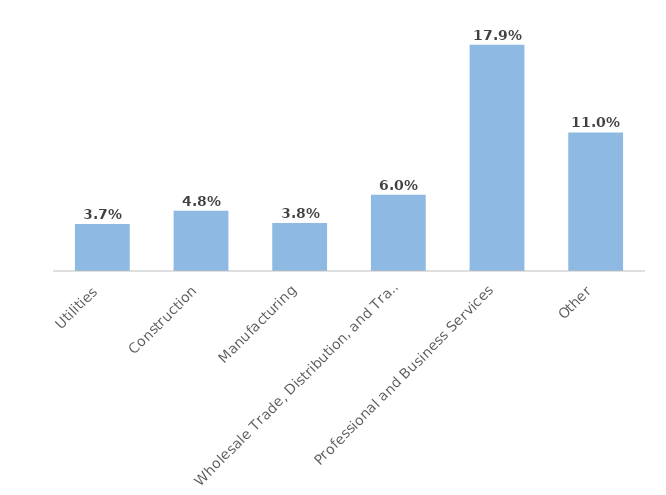
| Category | Series 0 |
|---|---|
| Utilities | 0.037 |
| Construction | 0.048 |
| Manufacturing | 0.038 |
| Wholesale Trade, Distribution, and Transport | 0.06 |
| Professional and Business Services | 0.179 |
| Other | 0.11 |